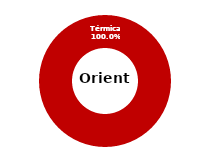
| Category | Oriente |
|---|---|
| Eólica | 0 |
| Hidráulica | 0 |
| Solar | 0 |
| Térmica | 70.312 |